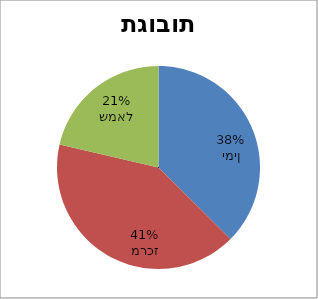
| Category | תגובות |
|---|---|
| ימין | 21436 |
| מרכז | 23572 |
| שמאל | 12234 |